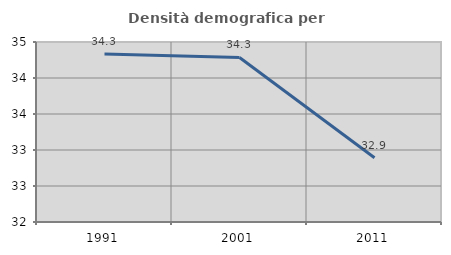
| Category | Densità demografica |
|---|---|
| 1991.0 | 34.333 |
| 2001.0 | 34.285 |
| 2011.0 | 32.892 |